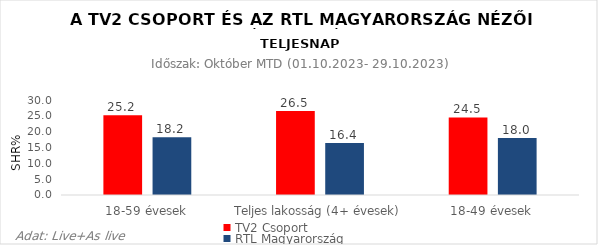
| Category | TV2 Csoport | RTL Magyarország |
|---|---|---|
| 18-59 évesek | 25.2 | 18.2 |
| Teljes lakosság (4+ évesek) | 26.5 | 16.4 |
| 18-49 évesek | 24.5 | 18 |